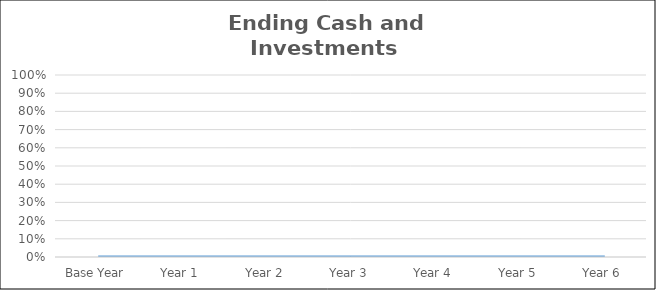
| Category | Ending Cash and Investments as Percent of Baseline |
|---|---|
| Base Year | 0 |
| Year 1 | 0 |
| Year 2 | 0 |
| Year 3 | 0 |
| Year 4 | 0 |
| Year 5 | 0 |
| Year 6 | 0 |